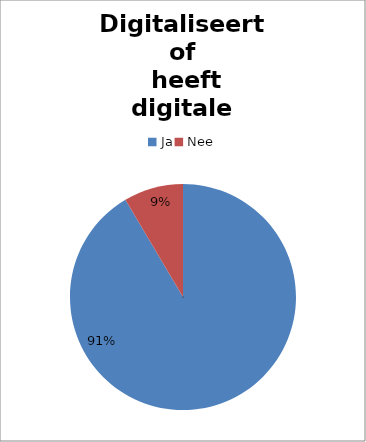
| Category | Series 0 |
|---|---|
| Ja | 129 |
| Nee | 12 |